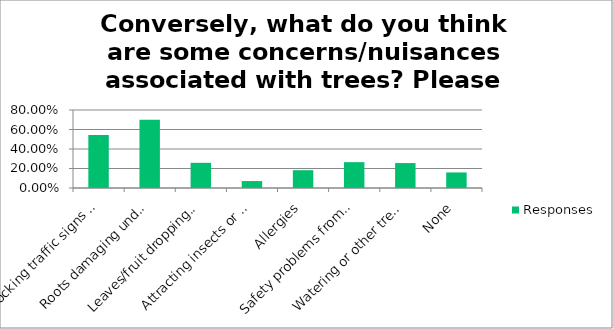
| Category | Responses |
|---|---|
| Blocking traffic signs and/or street lights | 0.543 |
| Roots damaging underground utilities or cracking the sidewalk/pavement | 0.701 |
| Leaves/fruit dropping and ongoing maintenance | 0.258 |
| Attracting insects or other pests | 0.071 |
| Allergies | 0.182 |
| Safety problems from falling limbs | 0.265 |
| Watering or other tree care duties | 0.256 |
| None | 0.16 |